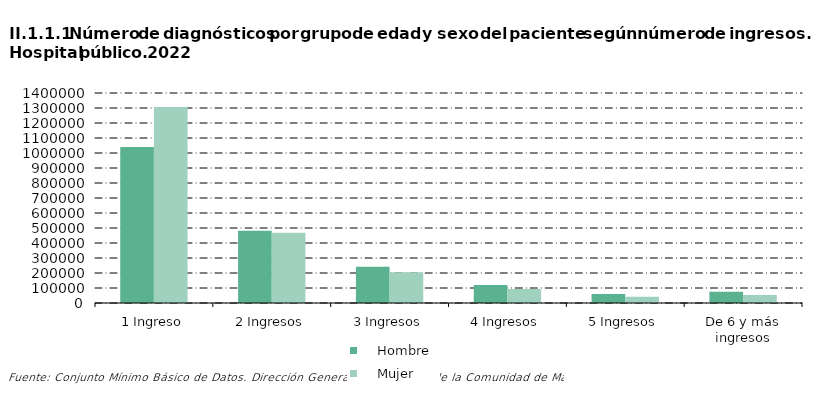
| Category |     Hombre |     Mujer |
|---|---|---|
| 1 Ingreso | 1040750 | 1306715 |
| 2 Ingresos | 481764 | 467764 |
| 3 Ingresos | 241910 | 204669 |
| 4 Ingresos | 120239 | 93699 |
| 5 Ingresos | 60625 | 41117 |
| De 6 y más ingresos | 75736 | 53654 |